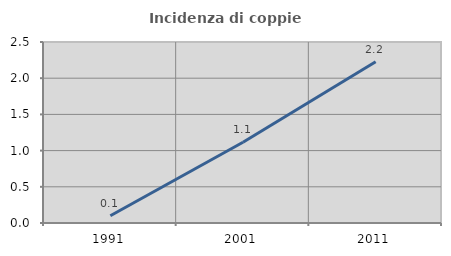
| Category | Incidenza di coppie miste |
|---|---|
| 1991.0 | 0.099 |
| 2001.0 | 1.115 |
| 2011.0 | 2.226 |